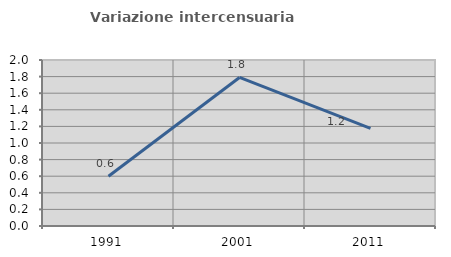
| Category | Variazione intercensuaria annua |
|---|---|
| 1991.0 | 0.599 |
| 2001.0 | 1.789 |
| 2011.0 | 1.177 |